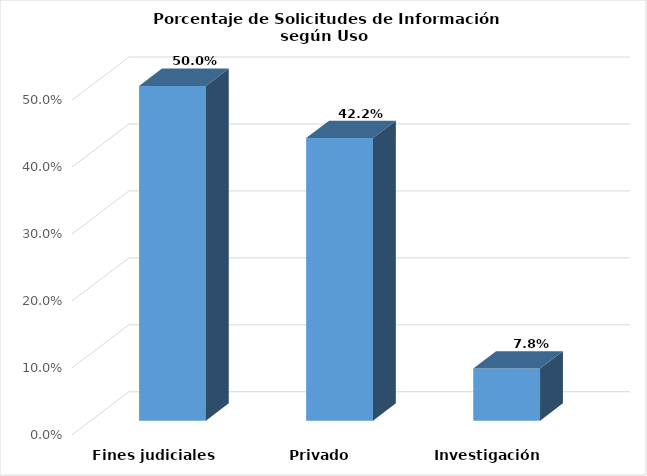
| Category | Series 0 |
|---|---|
| Fines judiciales | 0.5 |
| Privado | 0.422 |
| Investigación | 0.078 |